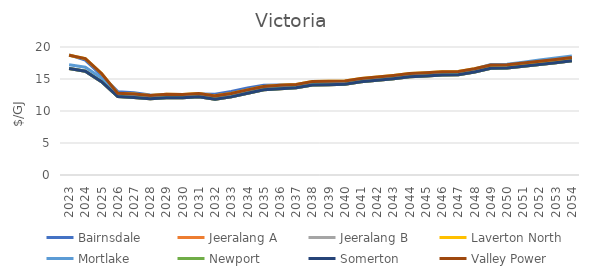
| Category | Bairnsdale | Jeeralang A | Jeeralang B | Laverton North | Mortlake | Newport | Somerton | Valley Power |
|---|---|---|---|---|---|---|---|---|
| 2023.0 | 18.766 | 16.628 | 16.628 | 18.716 | 17.222 | 16.628 | 16.628 | 18.716 |
| 2024.0 | 17.957 | 16.225 | 16.225 | 18.18 | 16.839 | 16.225 | 16.225 | 18.18 |
| 2025.0 | 15.577 | 14.571 | 14.571 | 15.867 | 15.172 | 14.571 | 14.571 | 15.867 |
| 2026.0 | 13.024 | 12.257 | 12.257 | 12.757 | 12.668 | 12.257 | 12.257 | 12.757 |
| 2027.0 | 12.872 | 12.114 | 12.114 | 12.639 | 12.575 | 12.114 | 12.114 | 12.639 |
| 2028.0 | 12.504 | 11.911 | 11.911 | 12.436 | 12.37 | 11.911 | 11.911 | 12.436 |
| 2029.0 | 12.381 | 12.075 | 12.075 | 12.6 | 12.532 | 12.075 | 12.075 | 12.6 |
| 2030.0 | 12.437 | 12.057 | 12.057 | 12.582 | 12.471 | 12.057 | 12.057 | 12.582 |
| 2031.0 | 12.671 | 12.224 | 12.224 | 12.749 | 12.615 | 12.224 | 12.224 | 12.749 |
| 2032.0 | 12.607 | 11.841 | 11.841 | 12.366 | 12.079 | 11.841 | 11.841 | 12.366 |
| 2033.0 | 13.069 | 12.204 | 12.204 | 12.729 | 12.456 | 12.204 | 12.204 | 12.729 |
| 2034.0 | 13.595 | 12.781 | 12.781 | 13.306 | 12.999 | 12.781 | 12.781 | 13.306 |
| 2035.0 | 14.013 | 13.305 | 13.305 | 13.83 | 13.52 | 13.305 | 13.305 | 13.83 |
| 2036.0 | 14.082 | 13.493 | 13.493 | 14.018 | 13.707 | 13.493 | 13.493 | 14.018 |
| 2037.0 | 14.102 | 13.622 | 13.622 | 14.147 | 13.834 | 13.622 | 13.622 | 14.147 |
| 2038.0 | 14.354 | 14.076 | 14.076 | 14.601 | 14.285 | 14.076 | 14.076 | 14.601 |
| 2039.0 | 14.375 | 14.118 | 14.118 | 14.643 | 14.325 | 14.118 | 14.118 | 14.643 |
| 2040.0 | 14.368 | 14.189 | 14.189 | 14.701 | 14.389 | 14.189 | 14.189 | 14.701 |
| 2041.0 | 14.722 | 14.575 | 14.575 | 15.087 | 14.773 | 14.575 | 14.575 | 15.087 |
| 2042.0 | 14.896 | 14.794 | 14.794 | 15.306 | 14.99 | 14.794 | 14.794 | 15.306 |
| 2043.0 | 15.212 | 15.052 | 15.052 | 15.564 | 15.375 | 15.052 | 15.052 | 15.564 |
| 2044.0 | 15.527 | 15.356 | 15.356 | 15.869 | 15.777 | 15.356 | 15.356 | 15.869 |
| 2045.0 | 15.624 | 15.468 | 15.468 | 15.981 | 15.882 | 15.468 | 15.468 | 15.981 |
| 2046.0 | 15.851 | 15.622 | 15.622 | 16.134 | 15.97 | 15.622 | 15.622 | 16.134 |
| 2047.0 | 15.881 | 15.666 | 15.666 | 16.179 | 16.037 | 15.666 | 15.666 | 16.179 |
| 2048.0 | 16.323 | 16.096 | 16.096 | 16.609 | 16.524 | 16.096 | 16.096 | 16.609 |
| 2049.0 | 16.962 | 16.676 | 16.676 | 17.189 | 17.264 | 16.676 | 16.676 | 17.189 |
| 2050.0 | 17.012 | 16.706 | 16.706 | 17.21 | 17.321 | 16.706 | 16.706 | 17.21 |
| 2051.0 | 17.315 | 16.983 | 16.983 | 17.487 | 17.636 | 16.983 | 16.983 | 17.487 |
| 2052.0 | 17.624 | 17.266 | 17.266 | 17.769 | 17.956 | 17.266 | 17.266 | 17.769 |
| 2053.0 | 17.939 | 17.553 | 17.553 | 18.056 | 18.283 | 17.553 | 17.553 | 18.056 |
| 2054.0 | 18.259 | 17.845 | 17.845 | 18.346 | 18.615 | 17.845 | 17.845 | 18.346 |